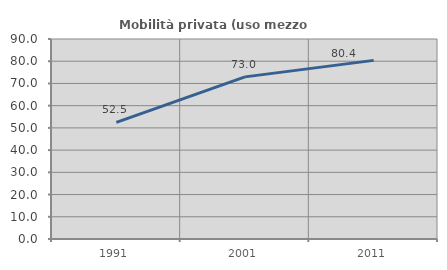
| Category | Mobilità privata (uso mezzo privato) |
|---|---|
| 1991.0 | 52.468 |
| 2001.0 | 72.959 |
| 2011.0 | 80.376 |